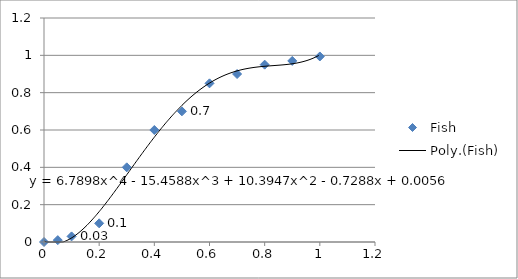
| Category | Fish |
|---|---|
| 1.0 | 0.994 |
| 0.9 | 0.97 |
| 0.8 | 0.95 |
| 0.7 | 0.9 |
| 0.6 | 0.85 |
| 0.5 | 0.7 |
| 0.4 | 0.6 |
| 0.3 | 0.4 |
| 0.2 | 0.1 |
| 0.1 | 0.03 |
| 0.05 | 0.01 |
| 0.0 | 0 |